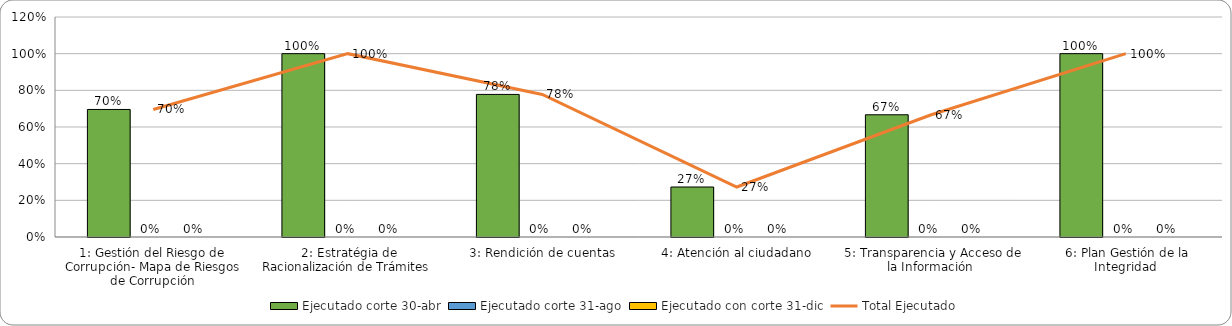
| Category | Ejecutado corte 30-abr | Ejecutado corte 31-ago | Ejecutado con corte 31-dic |
|---|---|---|---|
| 1: Gestión del Riesgo de Corrupción- Mapa de Riesgos de Corrupción | 0.696 | 0 | 0 |
|  2: Estratégia de Racionalización de Trámites | 1 | 0 | 0 |
|  3: Rendición de cuentas | 0.778 | 0 | 0 |
|  4: Atención al ciudadano | 0.273 | 0 | 0 |
|  5: Transparencia y Acceso de la Información | 0.667 | 0 | 0 |
|  6: Plan Gestión de la Integridad | 1 | 0 | 0 |